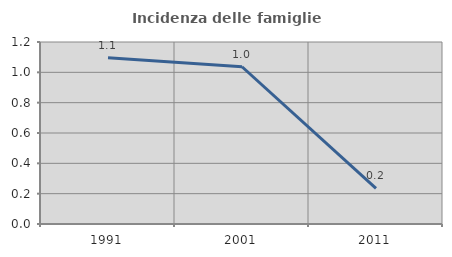
| Category | Incidenza delle famiglie numerose |
|---|---|
| 1991.0 | 1.096 |
| 2001.0 | 1.037 |
| 2011.0 | 0.236 |